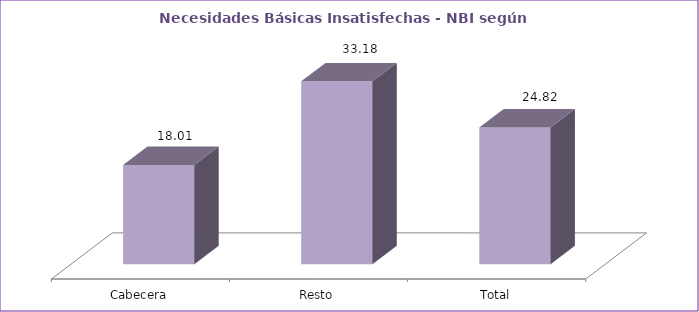
| Category | Series 0 |
|---|---|
| Cabecera | 18.01 |
| Resto | 33.18 |
| Total | 24.82 |